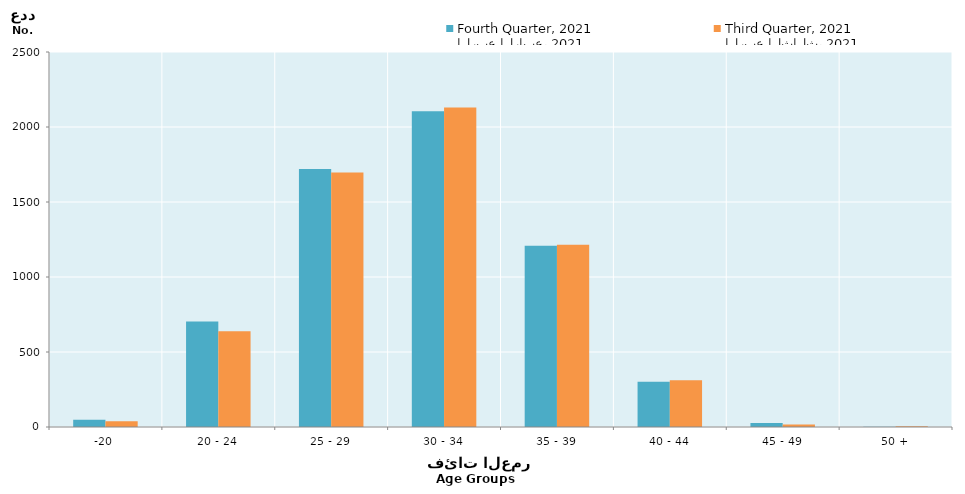
| Category | الربع الرابع، 2021
Fourth Quarter, 2021 | الربع الثالث، 2021
Third Quarter, 2021 |
|---|---|---|
| -20 | 49 | 39 |
| 20 - 24 | 704 | 639 |
| 25 - 29 | 1720 | 1697 |
| 30 - 34 | 2105 | 2130 |
| 35 - 39 | 1208 | 1215 |
| 40 - 44 | 302 | 311 |
| 45 - 49 | 26 | 16 |
| 50 + | 1 | 5 |